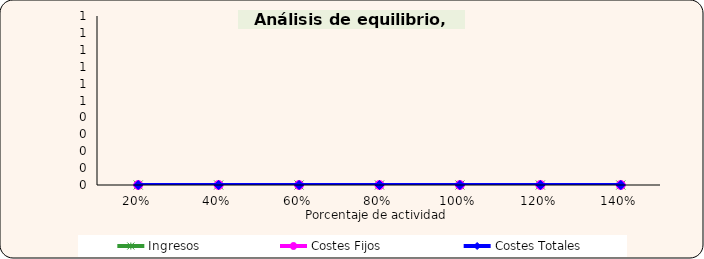
| Category | Ingresos | Costes Fijos | Costes Totales |
|---|---|---|---|
| 0.2 | 0 | 0 | 0 |
| 0.4 | 0 | 0 | 0 |
| 0.6 | 0 | 0 | 0 |
| 0.8 | 0 | 0 | 0 |
| 1.0 | 0 | 0 | 0 |
| 1.2 | 0 | 0 | 0 |
| 1.4 | 0 | 0 | 0 |